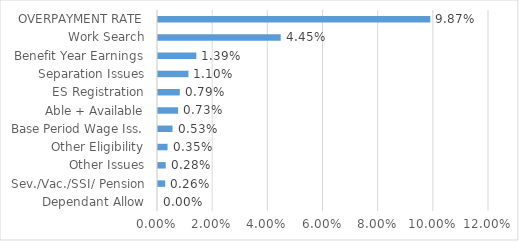
| Category | Series 0 |
|---|---|
| Dependant Allow | 0 |
| Sev./Vac./SSI/ Pension | 0.003 |
| Other Issues | 0.003 |
| Other Eligibility | 0.003 |
| Base Period Wage Iss. | 0.005 |
| Able + Available | 0.007 |
| ES Registration | 0.008 |
| Separation Issues | 0.011 |
| Benefit Year Earnings | 0.014 |
| Work Search | 0.044 |
| OVERPAYMENT RATE | 0.099 |